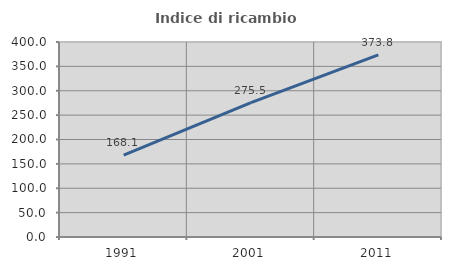
| Category | Indice di ricambio occupazionale  |
|---|---|
| 1991.0 | 168.103 |
| 2001.0 | 275.532 |
| 2011.0 | 373.75 |